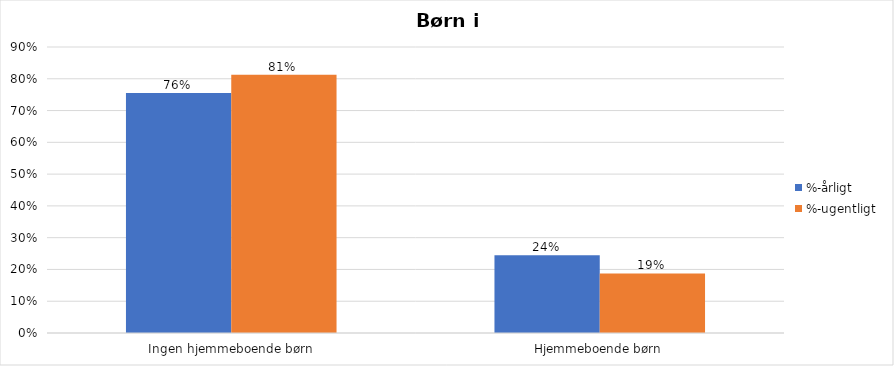
| Category | %-årligt | %-ugentligt |
|---|---|---|
| Ingen hjemmeboende børn | 0.755 | 0.812 |
| Hjemmeboende børn | 0.245 | 0.188 |